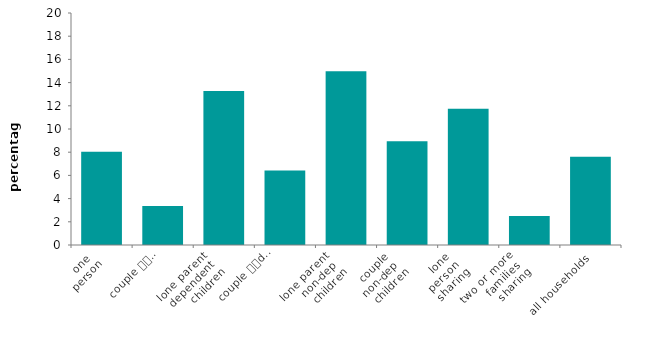
| Category | current arrears |
|---|---|
| one 
person | 8.035 |
| couple 
no children | 3.364 |
| lone parent 
dependent 
children | 13.269 |
| couple 
dependent 
children | 6.413 |
| lone parent 
non-dep 
children | 14.974 |
| couple 
non-dep 
children | 8.955 |
| lone 
person 
sharing | 11.755 |
| two or more 
families 
sharing | 2.492 |
| all households | 7.6 |